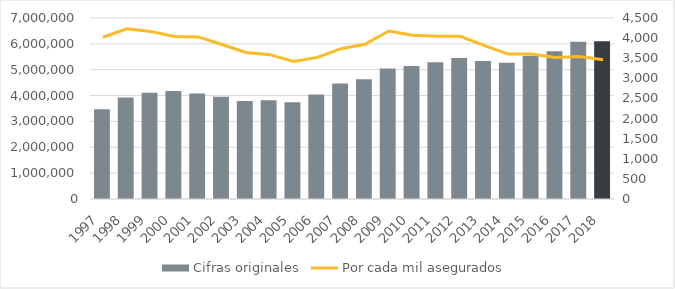
| Category | Cifras originales |
|---|---|
| 1997.0 | 3468195 |
| 1998.0 | 3921496 |
| 1999.0 | 4108940 |
| 2000.0 | 4180531 |
| 2001.0 | 4077289 |
| 2002.0 | 3955168 |
| 2003.0 | 3792837 |
| 2004.0 | 3814886 |
| 2005.0 | 3744629 |
| 2006.0 | 4039393 |
| 2007.0 | 4463731 |
| 2008.0 | 4632201 |
| 2009.0 | 5046701 |
| 2010.0 | 5146677 |
| 2011.0 | 5291816 |
| 2012.0 | 5457193 |
| 2013.0 | 5333950 |
| 2014.0 | 5273118 |
| 2015.0 | 5535687 |
| 2016.0 | 5711754 |
| 2017.0 | 6080996 |
| 2018.0 | 6101369 |